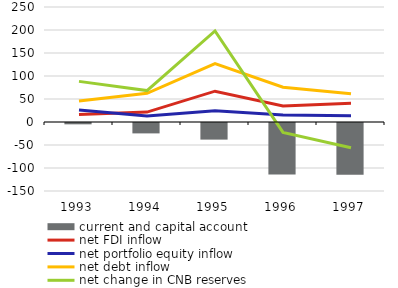
| Category | current and capital account |
|---|---|
| 1993.0 | -2.9 |
| 1994.0 | -22.6 |
| 1995.0 | -36.1 |
| 1996.0 | -111.9 |
| 1997.0 | -112.7 |